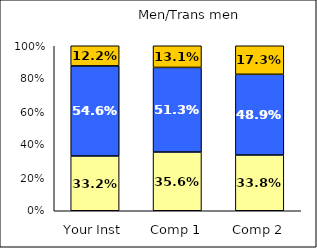
| Category | Low Academic Self-Concept | Average Academic Self-Concept | High Academic Self-Concept |
|---|---|---|---|
| Your Inst | 0.332 | 0.546 | 0.122 |
| Comp 1 | 0.356 | 0.513 | 0.131 |
| Comp 2 | 0.338 | 0.489 | 0.173 |